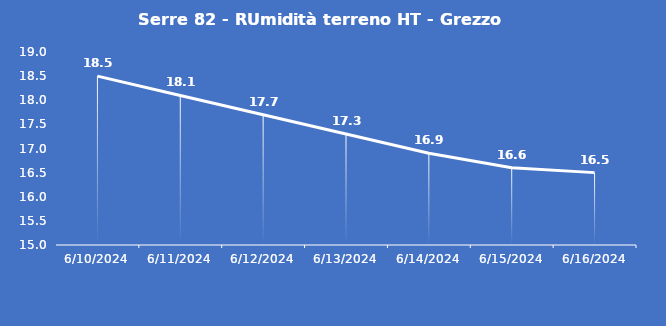
| Category | Serre 82 - RUmidità terreno HT - Grezzo (%VWC) |
|---|---|
| 6/10/24 | 18.5 |
| 6/11/24 | 18.1 |
| 6/12/24 | 17.7 |
| 6/13/24 | 17.3 |
| 6/14/24 | 16.9 |
| 6/15/24 | 16.6 |
| 6/16/24 | 16.5 |